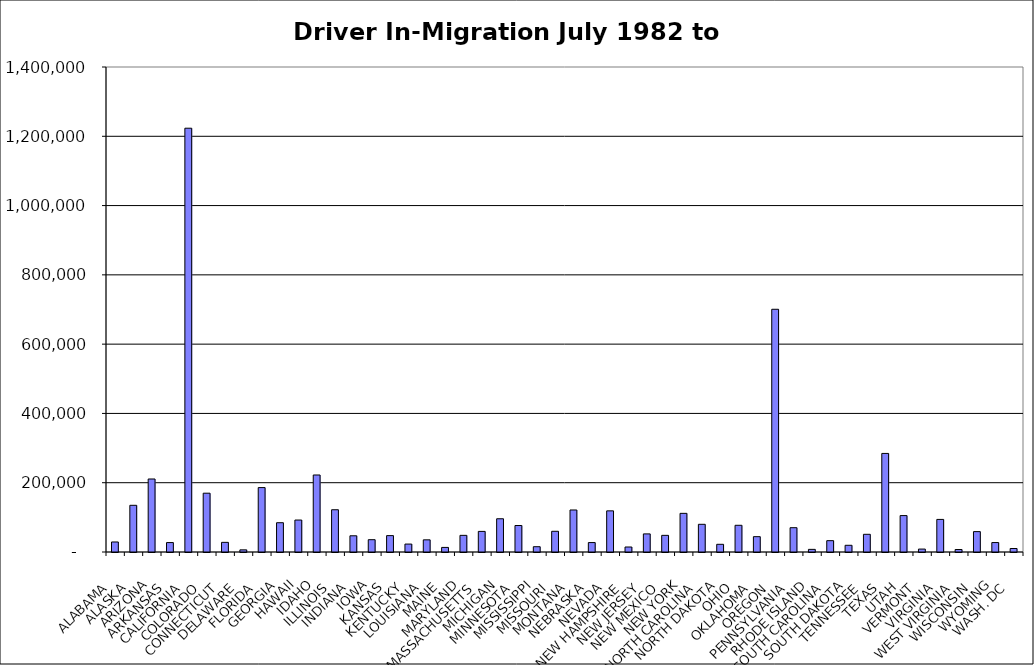
| Category | Series 0 |
|---|---|
|  ALABAMA  | 28914.5 |
|  ALASKA  | 134794.5 |
|  ARIZONA  | 210735 |
|  ARKANSAS  | 27217.5 |
|  CALIFORNIA  | 1223321.5 |
|  COLORADO  | 169751 |
|  CONNECTICUT  | 27853 |
|  DELAWARE  | 6193.5 |
|  FLORIDA  | 185960 |
|  GEORGIA  | 84564 |
|  HAWAII  | 92259.5 |
|  IDAHO  | 222291.5 |
|  ILLINOIS  | 121968.5 |
|  INDIANA  | 46796 |
|  IOWA  | 35534.5 |
|  KANSAS  | 47310.5 |
|  KENTUCKY  | 22901 |
|  LOUISIANA  | 35095.5 |
|  MAINE  | 13223.5 |
|  MARYLAND  | 48066 |
|  MASSACHUSETTS  | 59491 |
|  MICHIGAN  | 95978 |
|  MINNESOTA  | 76482.5 |
|  MISSISSIPPI  | 15249 |
|  MISSOURI  | 59778 |
|  MONTANA  | 121290 |
|  NEBRASKA  | 27206.5 |
|  NEVADA  | 118763 |
|  NEW HAMPSHIRE  | 14396.5 |
|  NEW JERSEY  | 52251 |
|  NEW MEXICO  | 48067 |
|  NEW YORK  | 111561 |
|  NORTH CAROLINA  | 79928.5 |
|  NORTH DAKOTA  | 22219.5 |
|  OHIO  | 77094.5 |
|  OKLAHOMA  | 44282 |
|  OREGON  | 700633 |
|  PENNSYLVANIA  | 70162.5 |
|  RHODE ISLAND  | 7578 |
|  SOUTH CAROLINA  | 32707.5 |
|  SOUTH DAKOTA  | 19357.5 |
|  TENNESSEE  | 51098.5 |
|  TEXAS  | 284519 |
|  UTAH  | 105098.5 |
|  VERMONT  | 8460 |
|  VIRGINIA  | 94064 |
|  WEST VIRGINIA  | 7136.5 |
|  WISCONSIN  | 58832.5 |
|  WYOMING  | 27276 |
|  WASH. DC  | 10096 |